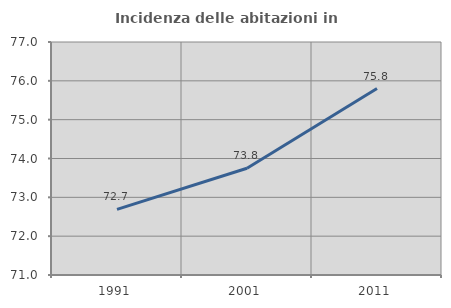
| Category | Incidenza delle abitazioni in proprietà  |
|---|---|
| 1991.0 | 72.689 |
| 2001.0 | 73.75 |
| 2011.0 | 75.801 |